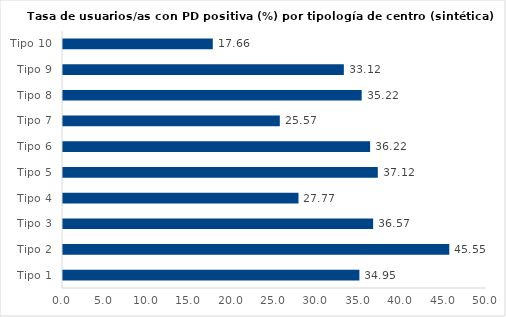
| Category | Series 0 |
|---|---|
| Tipo 1 | 34.953 |
| Tipo 2 | 45.554 |
| Tipo 3 | 36.573 |
| Tipo 4 | 27.771 |
| Tipo 5 | 37.122 |
| Tipo 6 | 36.217 |
| Tipo 7 | 25.568 |
| Tipo 8 | 35.221 |
| Tipo 9 | 33.119 |
| Tipo 10 | 17.664 |